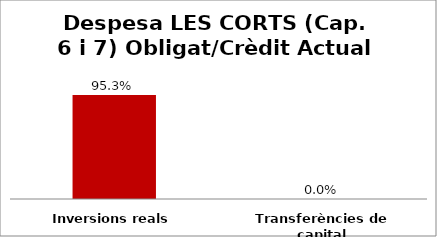
| Category | Series 0 |
|---|---|
| Inversions reals | 0.953 |
| Transferències de capital | 0 |